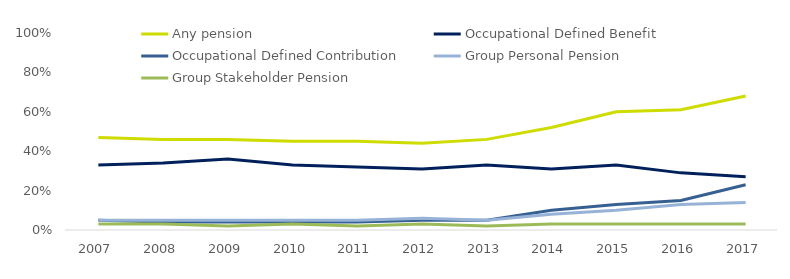
| Category | Any pension | Occupational Defined Benefit | Occupational Defined Contribution | Group Personal Pension | Group Stakeholder Pension |
|---|---|---|---|---|---|
| 2007.0 | 0.47 | 0.33 | 0.05 | 0.05 | 0.03 |
| 2008.0 | 0.46 | 0.34 | 0.04 | 0.05 | 0.03 |
| 2009.0 | 0.46 | 0.36 | 0.04 | 0.05 | 0.02 |
| 2010.0 | 0.45 | 0.33 | 0.04 | 0.05 | 0.03 |
| 2011.0 | 0.45 | 0.32 | 0.04 | 0.05 | 0.02 |
| 2012.0 | 0.44 | 0.31 | 0.05 | 0.06 | 0.03 |
| 2013.0 | 0.46 | 0.33 | 0.05 | 0.05 | 0.02 |
| 2014.0 | 0.52 | 0.31 | 0.1 | 0.08 | 0.03 |
| 2015.0 | 0.6 | 0.33 | 0.13 | 0.1 | 0.03 |
| 2016.0 | 0.61 | 0.29 | 0.15 | 0.13 | 0.03 |
| 2017.0 | 0.68 | 0.27 | 0.23 | 0.14 | 0.03 |